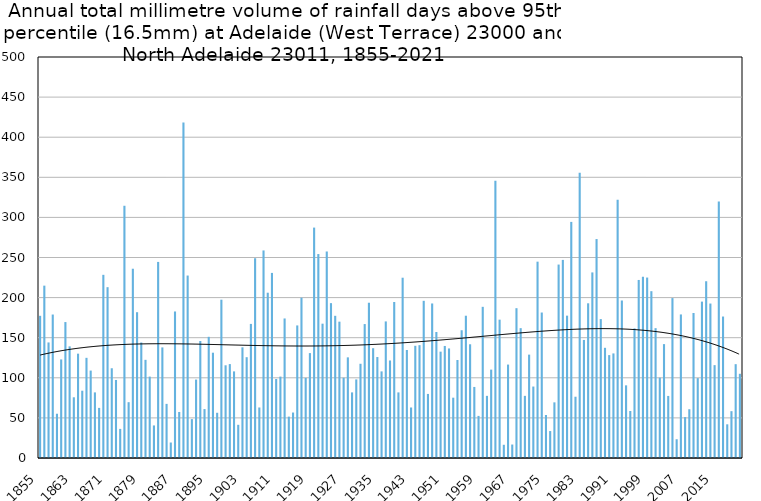
| Category | Annual total mm in days above 95th percentile |
|---|---|
| 1855 | 177.3 |
| 1856 | 214.9 |
| 1857 | 144.1 |
| 1858 | 178.9 |
| 1859 | 55.2 |
| 1860 | 122.9 |
| 1861 | 169.5 |
| 1862 | 139.2 |
| 1863 | 75.7 |
| 1864 | 130.1 |
| 1865 | 83.9 |
| 1866 | 124.9 |
| 1867 | 109 |
| 1868 | 81.8 |
| 1869 | 62.5 |
| 1870 | 228.4 |
| 1871 | 213 |
| 1872 | 111.9 |
| 1873 | 97.3 |
| 1874 | 36.3 |
| 1875 | 314.5 |
| 1876 | 69.6 |
| 1877 | 236 |
| 1878 | 181.8 |
| 1879 | 144 |
| 1880 | 122.4 |
| 1881 | 101.5 |
| 1882 | 40.6 |
| 1883 | 244.5 |
| 1884 | 137.9 |
| 1885 | 67.5 |
| 1886 | 19.3 |
| 1887 | 182.7 |
| 1888 | 57.4 |
| 1889 | 418.3 |
| 1890 | 227.5 |
| 1891 | 48.5 |
| 1892 | 97.8 |
| 1893 | 145.9 |
| 1894 | 61 |
| 1895 | 151.1 |
| 1896 | 131.3 |
| 1897 | 56.4 |
| 1898 | 197.4 |
| 1899 | 115.6 |
| 1900 | 117.1 |
| 1901 | 108 |
| 1902 | 41.4 |
| 1903 | 138 |
| 1904 | 125.7 |
| 1905 | 167.2 |
| 1906 | 249.1 |
| 1907 | 63 |
| 1908 | 258.8 |
| 1909 | 206.1 |
| 1910 | 230.8 |
| 1911 | 98.5 |
| 1912 | 101.5 |
| 1913 | 174 |
| 1914 | 51.6 |
| 1915 | 56.7 |
| 1916 | 165.3 |
| 1917 | 199.9 |
| 1918 | 99.9 |
| 1919 | 130.8 |
| 1920 | 287.3 |
| 1921 | 254.3 |
| 1922 | 167.5 |
| 1923 | 257.5 |
| 1924 | 193.1 |
| 1925 | 177.3 |
| 1926 | 170 |
| 1927 | 100.1 |
| 1928 | 125.5 |
| 1929 | 81.8 |
| 1930 | 98 |
| 1931 | 117.5 |
| 1932 | 167 |
| 1933 | 193.6 |
| 1934 | 136.9 |
| 1935 | 125.9 |
| 1936 | 108 |
| 1937 | 170.3 |
| 1938 | 121.6 |
| 1939 | 194.5 |
| 1940 | 81.8 |
| 1941 | 224.8 |
| 1942 | 134.7 |
| 1943 | 63 |
| 1944 | 139.9 |
| 1945 | 140.7 |
| 1946 | 196 |
| 1947 | 79.9 |
| 1948 | 192.7 |
| 1949 | 157.1 |
| 1950 | 132.6 |
| 1951 | 139.7 |
| 1952 | 136.6 |
| 1953 | 75.2 |
| 1954 | 122.2 |
| 1955 | 159.3 |
| 1956 | 177.4 |
| 1957 | 141.8 |
| 1958 | 88.6 |
| 1959 | 52.5 |
| 1960 | 188.5 |
| 1961 | 77.5 |
| 1962 | 110.2 |
| 1963 | 345.7 |
| 1964 | 172.5 |
| 1965 | 16.5 |
| 1966 | 116.5 |
| 1967 | 16.8 |
| 1968 | 186.8 |
| 1969 | 161.9 |
| 1970 | 77.5 |
| 1971 | 128.9 |
| 1972 | 89.1 |
| 1973 | 244.8 |
| 1974 | 181.4 |
| 1975 | 53.6 |
| 1976 | 33.6 |
| 1977 | 69.4 |
| 1978 | 241.2 |
| 1979 | 247 |
| 1980 | 177.5 |
| 1981 | 294.4 |
| 1982 | 76.4 |
| 1983 | 355.6 |
| 1984 | 147.2 |
| 1985 | 192.9 |
| 1986 | 231.4 |
| 1987 | 273 |
| 1988 | 173.2 |
| 1989 | 137.4 |
| 1990 | 128.3 |
| 1991 | 130.4 |
| 1992 | 322 |
| 1993 | 196.4 |
| 1994 | 90.6 |
| 1995 | 58.6 |
| 1996 | 161.6 |
| 1997 | 222 |
| 1998 | 226 |
| 1999 | 225 |
| 2000 | 208 |
| 2001 | 161.9 |
| 2002 | 100.2 |
| 2003 | 142 |
| 2004 | 77.4 |
| 2005 | 199.4 |
| 2006 | 23.4 |
| 2007 | 179 |
| 2008 | 51 |
| 2009 | 60.8 |
| 2010 | 180.8 |
| 2011 | 99.6 |
| 2012 | 195 |
| 2013 | 220.4 |
| 2014 | 192.6 |
| 2015 | 115.8 |
| 2016 | 319.8 |
| 2017 | 176.4 |
| 2018 | 42 |
| 2019 | 58.4 |
| 2020 | 117 |
| 2021 | 105 |